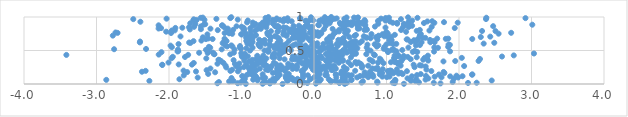
| Category | Series 0 |
|---|---|
| -0.4334073646067269 | 0.001 |
| -0.939989889521863 | 0.002 |
| 1.2405617422686799 | 0.003 |
| 0.4262052595053891 | 0.004 |
| -0.7084179706969396 | 0.005 |
| 0.026371199007586554 | 0.006 |
| 0.4197355923336872 | 0.007 |
| -0.6079167115914466 | 0.008 |
| 1.7446076683312128 | 0.009 |
| -0.7068555747968261 | 0.01 |
| -1.3325380423428452 | 0.011 |
| -1.0520788200525004 | 0.012 |
| 1.1143253733677696 | 0.013 |
| 0.3506991465777798 | 0.014 |
| -0.09265396512471646 | 0.015 |
| 2.1244856302807005 | 0.016 |
| 1.6524882005302848 | 0.017 |
| 0.4532999058368441 | 0.018 |
| 2.2437237397595773 | 0.019 |
| 1.0854853833457287 | 0.02 |
| 0.8759545842474674 | 0.021 |
| 0.6565602732987683 | 0.022 |
| -1.0106598257258739 | 0.023 |
| -0.13889777717082996 | 0.024 |
| 1.4479092154608768 | 0.025 |
| 0.34378344889433965 | 0.026 |
| 0.03760194395053418 | 0.027 |
| -0.6733068415117387 | 0.028 |
| -1.3115628436499165 | 0.029 |
| 1.9129522233115654 | 0.03 |
| -0.9605378301241476 | 0.031 |
| -0.6797413491408442 | 0.032 |
| 0.41761173556334974 | 0.033 |
| 0.23324107979920594 | 0.034 |
| 0.8714620650469147 | 0.035 |
| 0.07253313029421271 | 0.036 |
| -0.5498560819052356 | 0.037 |
| -0.24750394615729032 | 0.038 |
| -1.170913742902048 | 0.039 |
| 0.6747199698988968 | 0.04 |
| 0.23804257820382357 | 0.041 |
| -0.6091843622784143 | 0.042 |
| 1.3995825697188407 | 0.043 |
| -1.1388659981964393 | 0.044 |
| -1.1103735390533398 | 0.045 |
| -2.270802827437177 | 0.046 |
| 1.3367882534600461 | 0.047 |
| 0.2965901665627779 | 0.048 |
| -0.1938416605830513 | 0.049 |
| -0.37006355820149484 | 0.05 |
| -0.980141098250563 | 0.051 |
| 2.451292750344459 | 0.052 |
| -0.7795251129186216 | 0.053 |
| -0.36396117570223296 | 0.054 |
| 1.1232268789021767 | 0.055 |
| -0.35841521604838356 | 0.056 |
| -0.2849285408587434 | 0.057 |
| -0.24384661143231146 | 0.058 |
| 0.3940239492990827 | 0.059 |
| 0.5190762853444326 | 0.06 |
| 1.1184695994260725 | 0.061 |
| -2.865017453478459 | 0.062 |
| 0.5121580258730027 | 0.063 |
| -0.8389704716347115 | 0.064 |
| 1.538337877615482 | 0.065 |
| 0.09390023675950232 | 0.066 |
| 0.39757787905972286 | 0.067 |
| -0.05710177107560099 | 0.068 |
| 1.3307203521826176 | 0.069 |
| 0.20402396596835715 | 0.07 |
| -1.8562669029842231 | 0.071 |
| 1.4120314544509567 | 0.072 |
| -0.5350035023415929 | 0.073 |
| -0.9679350047809727 | 0.074 |
| -0.049438993206019965 | 0.075 |
| -0.9542135248979973 | 0.076 |
| -0.22768054035939223 | 0.077 |
| -0.7746380152175014 | 0.078 |
| 1.9299292074050731 | 0.079 |
| 0.429833434867227 | 0.08 |
| -0.5613754599807814 | 0.081 |
| -0.29444781087458605 | 0.082 |
| 1.5773354843357064 | 0.083 |
| 1.2897147121827155 | 0.084 |
| -0.6912212090515224 | 0.085 |
| -0.5151694951792836 | 0.086 |
| 0.07107838191121552 | 0.087 |
| 0.39901942942559465 | 0.088 |
| -1.1374363614291054 | 0.089 |
| -0.38752759048288965 | 0.09 |
| -0.7074572994240373 | 0.091 |
| -0.31305252145530815 | 0.092 |
| -0.6742272174610262 | 0.093 |
| -0.3509213025499349 | 0.094 |
| -0.15121483442379446 | 0.095 |
| -1.6041070323972493 | 0.096 |
| 1.9894150523607124 | 0.097 |
| 0.5948688133561522 | 0.098 |
| 0.30769961076061847 | 0.099 |
| 1.7593074792966918 | 0.1 |
| 0.004397286051987415 | 0.101 |
| 0.746408859515614 | 0.102 |
| 1.004650379601312 | 0.103 |
| 0.405678854290743 | 0.104 |
| -0.8022414939867222 | 0.105 |
| 0.04420225550819801 | 0.106 |
| 0.8175962081965871 | 0.107 |
| -0.4982477791079276 | 0.108 |
| 1.6640408987213435 | 0.109 |
| 0.9425712782497317 | 0.11 |
| 1.0423210478500922 | 0.111 |
| -0.9796353460120537 | 0.112 |
| -0.80089162458217 | 0.113 |
| 1.878850971655912 | 0.114 |
| 1.3500643606173046 | 0.115 |
| 2.048505086340027 | 0.116 |
| -0.3926718015736288 | 0.117 |
| -0.9909470555270534 | 0.118 |
| 0.6346064744748094 | 0.119 |
| 1.5447146991797451 | 0.12 |
| 0.49646894159085875 | 0.121 |
| 0.40157587272972783 | 0.122 |
| 0.7604725467324265 | 0.123 |
| 1.965048531532113 | 0.124 |
| 0.6801633323095366 | 0.125 |
| -0.15158060905314663 | 0.126 |
| 0.17690633805504774 | 0.127 |
| -0.8419979458006646 | 0.128 |
| -1.7961105308612728 | 0.129 |
| -0.08366216637337853 | 0.13 |
| 0.5211920037019411 | 0.131 |
| 0.15693250197809583 | 0.132 |
| 1.4199556729727085 | 0.133 |
| 0.7192236721436274 | 0.134 |
| 0.4732046609789178 | 0.135 |
| 0.8107709534255987 | 0.136 |
| -0.9235467213476181 | 0.137 |
| -0.47360254949273095 | 0.138 |
| 2.1799910839399814 | 0.139 |
| 0.29963139587660326 | 0.14 |
| 0.30335159402384804 | 0.141 |
| 1.723050308760551 | 0.142 |
| 2.184743299009444 | 0.143 |
| 0.9064870357201658 | 0.144 |
| -0.7076771551211385 | 0.145 |
| -0.8239011722037857 | 0.146 |
| 1.222266459305855 | 0.147 |
| 1.4722602482084426 | 0.148 |
| -0.5085893657633891 | 0.149 |
| -1.459789470289941 | 0.15 |
| -0.34843980797931806 | 0.151 |
| -0.14923922319025795 | 0.152 |
| 0.07839754005029853 | 0.153 |
| -0.8879883673925066 | 0.154 |
| 1.165953396124717 | 0.155 |
| 0.37379590087292147 | 0.156 |
| 0.05089962901384659 | 0.157 |
| -0.8503444646355236 | 0.158 |
| 0.41427596236939834 | 0.159 |
| -0.8850225094193842 | 0.16 |
| 1.0957762818134933 | 0.161 |
| 0.3911124502370109 | 0.162 |
| 0.9413574605796713 | 0.163 |
| 1.799036500969354 | 0.164 |
| 1.0369042795173389 | 0.165 |
| -0.5681890178720375 | 0.166 |
| 1.2011396510350112 | 0.167 |
| 0.7817973203908286 | 0.168 |
| -0.5041007567814502 | 0.169 |
| 0.05334944350710735 | 0.17 |
| 0.9263511612173296 | 0.171 |
| 1.0831280800480183 | 0.172 |
| 0.04866020864090714 | 0.173 |
| 0.6988674593576363 | 0.174 |
| -1.36373038757322 | 0.175 |
| 0.1698882466925573 | 0.176 |
| -0.8844673432820551 | 0.177 |
| -1.7483739072513629 | 0.178 |
| 0.0517443807141964 | 0.179 |
| 1.7875587738228242 | 0.18 |
| -0.5131498555934719 | 0.181 |
| 0.7721722529966009 | 0.182 |
| -2.373111820209326 | 0.183 |
| 1.145852080504973 | 0.184 |
| 0.9088565782813038 | 0.185 |
| 0.3795641733459103 | 0.186 |
| -1.6275002375514465 | 0.187 |
| -0.5034526955605809 | 0.188 |
| -1.0488757826669808 | 0.189 |
| -0.39560230772946614 | 0.19 |
| 1.2818986424648493 | 0.191 |
| -0.1707045652295509 | 0.192 |
| 1.6186221438098372 | 0.193 |
| 1.0198962063709587 | 0.194 |
| -1.153655556877105 | 0.195 |
| -2.322315006178832 | 0.196 |
| 0.5676207583245985 | 0.197 |
| 1.065159388694794 | 0.198 |
| 0.432074671768528 | 0.199 |
| -1.7992951095651595 | 0.2 |
| 1.0476043433274826 | 0.201 |
| -0.8433569625095174 | 0.202 |
| -0.14951334799523153 | 0.203 |
| -0.7953696284243454 | 0.204 |
| -0.15543003967784585 | 0.205 |
| -1.4813896907287933 | 0.206 |
| -0.6329918320029906 | 0.207 |
| 0.24451507782589577 | 0.208 |
| 0.2595083056665448 | 0.209 |
| -0.004752674283597713 | 0.21 |
| -0.46033337125274976 | 0.211 |
| -1.1296804534601925 | 0.212 |
| 0.0956043102574533 | 0.213 |
| -0.6611368800254134 | 0.214 |
| 1.5504905273570948 | 0.215 |
| -0.0158265711336405 | 0.216 |
| -0.4574583408740951 | 0.217 |
| 0.013700335959944354 | 0.218 |
| 1.1427518138597197 | 0.219 |
| -0.8897695776031274 | 0.22 |
| 0.1553012019026987 | 0.221 |
| 0.9485274389356038 | 0.222 |
| 0.8722093412662391 | 0.223 |
| 0.4496850645398469 | 0.224 |
| -0.2952770188008369 | 0.225 |
| -0.5084181546463835 | 0.226 |
| -0.23916688574648592 | 0.227 |
| 0.84421292414312 | 0.228 |
| 0.3011691595279018 | 0.229 |
| -0.7462129076706683 | 0.23 |
| -1.4283212716359373 | 0.231 |
| 0.8032795524260266 | 0.232 |
| -1.0278743958917573 | 0.233 |
| 0.031107569460051998 | 0.234 |
| 0.005122731323344176 | 0.235 |
| -0.6008314070957574 | 0.236 |
| 0.06899006584817613 | 0.237 |
| 0.0663587108743986 | 0.238 |
| -0.86971987119502 | 0.239 |
| -0.12156581204872907 | 0.24 |
| -0.12175508005397262 | 0.241 |
| 0.06276419407169254 | 0.242 |
| 0.22510043600184204 | 0.243 |
| 0.8738545522013013 | 0.244 |
| 0.6602057214166779 | 0.245 |
| -0.43323039727528556 | 0.246 |
| -1.2100352835183887 | 0.247 |
| -0.365743396824465 | 0.248 |
| -0.3602150881303068 | 0.249 |
| 0.08772647501639774 | 0.25 |
| 1.3872202637846724 | 0.251 |
| -0.9674995294876982 | 0.252 |
| 0.41396599546430846 | 0.253 |
| 0.02965276846248699 | 0.254 |
| 0.2812963971135991 | 0.255 |
| -0.9153309791628157 | 0.256 |
| -0.23239003615902298 | 0.257 |
| -0.0407841863433811 | 0.258 |
| 0.1630460551598647 | 0.259 |
| -0.5026464128086214 | 0.26 |
| 0.12527876789902148 | 0.261 |
| 1.5403971777236887 | 0.262 |
| -1.0721724084046436 | 0.263 |
| 0.6687236159201184 | 0.264 |
| -0.8223687338873491 | 0.265 |
| 0.24256959283218116 | 0.266 |
| -0.5854110249986268 | 0.267 |
| 2.0708557042875277 | 0.268 |
| 0.1904578965428403 | 0.269 |
| -0.648089185168498 | 0.27 |
| -1.0609507773447842 | 0.271 |
| 0.7465586524288517 | 0.272 |
| 0.2786409662512028 | 0.273 |
| 1.1952639721511442 | 0.274 |
| -1.2201102890481161 | 0.275 |
| 1.4824241243588636 | 0.276 |
| -0.24101059581652873 | 0.277 |
| -0.30441671662254777 | 0.278 |
| -0.4620878137908555 | 0.279 |
| 1.457946268571093 | 0.28 |
| 0.19666000960113816 | 0.281 |
| 0.5115803055798924 | 0.282 |
| -0.11296635552697243 | 0.283 |
| -0.6959408783178276 | 0.284 |
| -2.09364037900715 | 0.285 |
| -0.6861935246085427 | 0.286 |
| -2.0926137116004977 | 0.287 |
| 1.3742604210529432 | 0.288 |
| -1.6835856428119262 | 0.289 |
| -0.9357321834524939 | 0.29 |
| -0.005975816455721095 | 0.291 |
| -1.8659647576706018 | 0.292 |
| -0.7887099334983327 | 0.293 |
| -0.5190692777042489 | 0.294 |
| -0.022162146743186284 | 0.295 |
| -0.8520607547844561 | 0.296 |
| -0.8298466177942627 | 0.297 |
| -0.08192551220203637 | 0.298 |
| 0.6460173355145313 | 0.299 |
| -1.0908086642009955 | 0.3 |
| -0.3557627683433928 | 0.301 |
| 1.158290216551368 | 0.302 |
| -1.331443222231699 | 0.303 |
| 0.5885099058603913 | 0.304 |
| -1.0315578146120012 | 0.305 |
| -0.7868457924492303 | 0.306 |
| -0.16184018273465828 | 0.307 |
| -0.09245943064964557 | 0.308 |
| 0.03367743662375755 | 0.309 |
| 0.9587318791425021 | 0.31 |
| 1.1530430693387004 | 0.311 |
| 1.1726852886773704 | 0.312 |
| -0.1586450865022062 | 0.313 |
| -1.658197194084864 | 0.314 |
| -1.2494329115209357 | 0.315 |
| 0.06633072430617659 | 0.316 |
| 0.34239667409953256 | 0.317 |
| -0.5527745834217752 | 0.318 |
| 0.8833659243989516 | 0.319 |
| -2.006661737776946 | 0.32 |
| -0.7563712102604887 | 0.321 |
| 0.6139512014308934 | 0.322 |
| -0.6911063923022773 | 0.323 |
| -0.7414872847641663 | 0.324 |
| 1.0606826368020945 | 0.325 |
| 0.47394917455532504 | 0.326 |
| -0.782224334343308 | 0.327 |
| 0.5717563593310331 | 0.328 |
| 1.1112380256577001 | 0.329 |
| -0.20403099130518676 | 0.33 |
| 1.1253284475364564 | 0.331 |
| 0.1768320488393389 | 0.332 |
| -0.6854399186522695 | 0.333 |
| 0.8114857188351943 | 0.334 |
| 0.3489921497415489 | 0.335 |
| -0.05046704188499174 | 0.336 |
| 1.7854750308439513 | 0.337 |
| -0.8936552380333875 | 0.338 |
| -0.7515984510628595 | 0.339 |
| 0.22055388576712165 | 0.34 |
| -1.2801636822769442 | 0.341 |
| 1.2049357891778225 | 0.342 |
| 1.9482436374981367 | 0.343 |
| 2.2697978813679374 | 0.344 |
| 1.10597453265635 | 0.345 |
| 0.3998960338028015 | 0.346 |
| -0.10292013319574789 | 0.347 |
| -0.9603227425281 | 0.348 |
| 1.5762466433641764 | 0.349 |
| 0.31962515981985096 | 0.35 |
| 0.7940529826544136 | 0.351 |
| 0.1627533932439622 | 0.352 |
| 0.2972896393977891 | 0.353 |
| 0.9273713687871252 | 0.354 |
| -0.01591665336942505 | 0.355 |
| -1.1087087002632199 | 0.356 |
| 0.3626749902187898 | 0.357 |
| -0.10413074414349222 | 0.358 |
| -1.3059935049827391 | 0.359 |
| 0.028628135749537265 | 0.36 |
| -0.851117588831209 | 0.361 |
| -1.3177117778340133 | 0.362 |
| 1.5065328957769069 | 0.363 |
| 0.767383452526575 | 0.364 |
| 0.27419406315858286 | 0.365 |
| 0.3938534242306213 | 0.366 |
| -0.30304245607331115 | 0.367 |
| -0.40579275365645806 | 0.368 |
| -0.26761825152569774 | 0.369 |
| 1.333481157530752 | 0.37 |
| 0.2075694136078905 | 0.371 |
| -0.7979000965923877 | 0.372 |
| 2.289101109045932 | 0.373 |
| 1.560488974147555 | 0.374 |
| -0.24300810092169378 | 0.375 |
| -0.20030884656237102 | 0.376 |
| -0.7414653196780696 | 0.377 |
| 0.9081021742499278 | 0.378 |
| -0.6921989451618265 | 0.379 |
| 1.2290538262865303 | 0.38 |
| -0.6568176364982543 | 0.381 |
| -1.485643759424411 | 0.382 |
| -0.47292750665285954 | 0.383 |
| -0.7219503619876484 | 0.384 |
| -1.9641738665962638 | 0.385 |
| 0.06417746321728846 | 0.386 |
| 1.1040371896724084 | 0.387 |
| 0.10943640472872929 | 0.388 |
| 0.3307645919241651 | 0.389 |
| 2.03883909163099 | 0.39 |
| 1.5267205023048707 | 0.391 |
| 0.23385568980842208 | 0.392 |
| 0.0550819722932836 | 0.393 |
| 0.08155990160945237 | 0.394 |
| -0.9541988726692265 | 0.395 |
| 0.50874047294759 | 0.396 |
| -0.5438801930841937 | 0.397 |
| -0.11903540839545368 | 0.398 |
| 1.4169036328053597 | 0.399 |
| -0.5721943186091663 | 0.4 |
| 1.123641966909661 | 0.401 |
| -0.17144313865374983 | 0.402 |
| -1.7790199674980318 | 0.403 |
| 1.2933452189920294 | 0.404 |
| 0.19747511778305338 | 0.405 |
| -1.9472513861214198 | 0.406 |
| -0.9941587205182794 | 0.407 |
| -0.262889259771077 | 0.408 |
| -0.29362053281824263 | 0.409 |
| 2.5929828463551114 | 0.41 |
| 1.169122998267718 | 0.411 |
| -0.912520219718739 | 0.412 |
| -0.5664530596501285 | 0.413 |
| -0.1335620251276497 | 0.414 |
| -0.04361760114944069 | 0.415 |
| 0.016920743623393797 | 0.416 |
| 0.09239461140514216 | 0.417 |
| -0.11736960964954335 | 0.418 |
| 1.237862996708694 | 0.419 |
| -0.0463884573470299 | 0.42 |
| -0.7829063142911616 | 0.421 |
| 0.29754248643946646 | 0.422 |
| 1.5708402036895048 | 0.423 |
| 1.11179493928008 | 0.424 |
| -0.6990101498638763 | 0.425 |
| -0.997056266207105 | 0.426 |
| 2.7554581097491084 | 0.427 |
| 0.35215814213386043 | 0.428 |
| 1.1630107921893291 | 0.429 |
| 0.8393776772817061 | 0.43 |
| -0.012845543929070224 | 0.431 |
| -0.04540093091730402 | 0.432 |
| -0.03856717934085285 | 0.433 |
| -3.4156052474357357 | 0.434 |
| -1.735664934826385 | 0.435 |
| -0.5661671280289662 | 0.436 |
| 0.3928403621358658 | 0.437 |
| 0.5346349792086365 | 0.438 |
| -2.1417708058184943 | 0.439 |
| -0.18996845839261933 | 0.44 |
| -0.48833262370674646 | 0.441 |
| 0.8252296667296708 | 0.442 |
| -1.1555938547148266 | 0.443 |
| -1.3730579219372805 | 0.444 |
| 0.72131386098948 | 0.445 |
| -1.3784872949835183 | 0.446 |
| 0.27136609530521394 | 0.447 |
| 0.2304055681444792 | 0.448 |
| 0.1644966682132596 | 0.449 |
| -0.9525786719599321 | 0.45 |
| 0.5782393635439345 | 0.451 |
| 0.37201452668525903 | 0.452 |
| -0.022340539404364534 | 0.453 |
| -0.02576436014300576 | 0.454 |
| 3.0342458904284832 | 0.455 |
| -0.06119464395791763 | 0.456 |
| -0.45834601621428295 | 0.457 |
| -0.02630865087045997 | 0.458 |
| -0.5446507800875304 | 0.459 |
| -1.0031466135791822 | 0.46 |
| -0.1606245262815884 | 0.461 |
| 0.5267212749705479 | 0.462 |
| -1.4662365903855186 | 0.463 |
| 0.32818397536131716 | 0.464 |
| -0.45335277920938566 | 0.465 |
| -1.58448545432603 | 0.466 |
| -1.1055205264086263 | 0.467 |
| -1.3952054678133505 | 0.468 |
| 0.45314074556177797 | 0.469 |
| 0.31026849990799743 | 0.47 |
| 0.35733672284083795 | 0.471 |
| 0.5717281660531954 | 0.472 |
| 0.5274938366934183 | 0.473 |
| 0.01776221919283305 | 0.474 |
| -2.104048430157656 | 0.475 |
| 1.0210040614094247 | 0.476 |
| 0.06777890744500681 | 0.477 |
| 1.4239032500869673 | 0.478 |
| 1.3625139483762476 | 0.479 |
| -0.6311696049064377 | 0.48 |
| -0.10589943997119011 | 0.481 |
| -0.42183148953034344 | 0.482 |
| -0.05103986692401019 | 0.483 |
| 1.655885032584676 | 0.484 |
| -1.8820659758326634 | 0.485 |
| -1.4622608249160667 | 0.486 |
| 1.876583142208636 | 0.487 |
| 1.13728392520696 | 0.488 |
| 0.39214952008823545 | 0.489 |
| -0.11654639091270269 | 0.49 |
| -0.46093620791680223 | 0.491 |
| -1.8728463295830622 | 0.492 |
| -0.6260974709770535 | 0.493 |
| -0.40175691405211733 | 0.494 |
| 1.389080570773852 | 0.495 |
| 0.20917348876430442 | 0.496 |
| -0.18337981633072165 | 0.497 |
| 0.7798986187877892 | 0.498 |
| -0.8817061668872537 | 0.499 |
| -0.6821683361714772 | 0.5 |
| 1.1089334458919042 | 0.501 |
| 1.006404715469169 | 0.502 |
| -0.3188931364893053 | 0.503 |
| -0.4703576693181075 | 0.504 |
| 0.7451895706422089 | 0.505 |
| 1.0693678117035326 | 0.506 |
| 1.2173708468090894 | 0.507 |
| 0.10363338912804121 | 0.508 |
| 0.4289295886938156 | 0.509 |
| -1.4897852723134983 | 0.51 |
| 0.4090758541233317 | 0.511 |
| -0.40055564662783194 | 0.512 |
| -0.630590498551503 | 0.513 |
| -1.876261664110996 | 0.514 |
| -1.0958224269822239 | 0.515 |
| 0.2987524686738334 | 0.516 |
| -1.273065701605872 | 0.517 |
| 0.500293659378614 | 0.518 |
| -2.7570676352767194 | 0.519 |
| 0.2620421341040906 | 0.52 |
| -0.39541553389043926 | 0.521 |
| 1.089712987111005 | 0.522 |
| -2.3164796602033917 | 0.523 |
| -0.12497734191465426 | 0.524 |
| -0.0085754152551063 | 0.525 |
| 0.9616920150703283 | 0.526 |
| -0.12889447908937868 | 0.527 |
| 0.08612663628894346 | 0.528 |
| -0.5154236349761243 | 0.529 |
| -1.0063687976658988 | 0.53 |
| 0.21130608010760898 | 0.531 |
| 0.5116895187969401 | 0.532 |
| 0.14714933012745135 | 0.533 |
| -0.9320481634849074 | 0.534 |
| 0.5977841224621425 | 0.535 |
| -0.49773216723541314 | 0.536 |
| -0.07770087246693791 | 0.537 |
| 0.5591575325699552 | 0.538 |
| -0.5471792626135867 | 0.539 |
| 1.7098937744332172 | 0.54 |
| -1.4317214836462773 | 0.541 |
| -0.846679342308545 | 0.542 |
| 0.7272223821072767 | 0.543 |
| 1.301879318621765 | 0.544 |
| -1.0226988605742626 | 0.545 |
| 0.1917322345546646 | 0.546 |
| 1.6596717855490635 | 0.547 |
| -0.5013296731567474 | 0.548 |
| 0.12182977930005379 | 0.549 |
| -1.9604425965302648 | 0.55 |
| 0.11857289088973566 | 0.551 |
| 0.9704573387404132 | 0.552 |
| 1.8511137175648713 | 0.553 |
| -0.1987336925435912 | 0.554 |
| -1.4494008591954337 | 0.555 |
| -0.738614601238547 | 0.556 |
| 0.5022135301410966 | 0.557 |
| 0.8657628352336486 | 0.558 |
| -0.31314331007774765 | 0.559 |
| -1.1984111724642252 | 0.56 |
| -1.1261219038654575 | 0.561 |
| -0.42499585121479555 | 0.562 |
| 0.5290323372120058 | 0.563 |
| 0.546079868079854 | 0.564 |
| 0.04692607066626042 | 0.565 |
| -1.0206544891017932 | 0.566 |
| 0.4419654640485735 | 0.567 |
| 0.5739616024400735 | 0.568 |
| -0.7555136433454832 | 0.569 |
| 0.3292412028631615 | 0.57 |
| -0.6067194591846352 | 0.571 |
| -0.5376457851892544 | 0.572 |
| -1.9782524527619154 | 0.573 |
| -0.11920899354407055 | 0.574 |
| 1.4054616154817214 | 0.575 |
| -1.1405609713521034 | 0.576 |
| 0.2413831807482163 | 0.577 |
| 0.8874412211775189 | 0.578 |
| -1.2247979217287135 | 0.579 |
| -0.28159048382586427 | 0.58 |
| -0.43487177378018504 | 0.581 |
| 1.460753603688425 | 0.582 |
| -0.0022818769860881716 | 0.583 |
| 1.8741133193134631 | 0.584 |
| -0.866557718359596 | 0.585 |
| -0.026169299669445145 | 0.586 |
| 0.3172814221917397 | 0.587 |
| 0.736881033919154 | 0.588 |
| 1.8554883525787726 | 0.589 |
| -0.1900926987907532 | 0.59 |
| 0.9990306143618994 | 0.591 |
| -0.608389371670019 | 0.592 |
| 0.8370774414834017 | 0.593 |
| -0.251465041497438 | 0.594 |
| -0.7664836097347552 | 0.595 |
| -1.868448286742482 | 0.596 |
| 1.0917746253525795 | 0.597 |
| 0.12885335257647945 | 0.598 |
| 1.1352722474220762 | 0.599 |
| -0.38115059022132325 | 0.6 |
| -0.6731338462520284 | 0.601 |
| -0.9180103909598412 | 0.602 |
| 2.340550359284501 | 0.603 |
| 0.31976112494028186 | 0.604 |
| 0.4909104392345238 | 0.605 |
| -0.4957570006932137 | 0.606 |
| -0.7359745190435927 | 0.607 |
| 0.045881250048879885 | 0.608 |
| 1.0548892767977076 | 0.609 |
| -1.260177409245058 | 0.61 |
| 0.5616303570727164 | 0.611 |
| 0.4276799855395783 | 0.612 |
| -1.7045296740470688 | 0.613 |
| 0.6300271883630915 | 0.614 |
| 2.4866764303683144 | 0.615 |
| 0.3769185888161557 | 0.616 |
| -0.013516653219761032 | 0.617 |
| -0.5004436771900664 | 0.618 |
| -1.7221320475818542 | 0.619 |
| 0.18878867740590444 | 0.62 |
| -2.4021073187453714 | 0.621 |
| 1.4839332351637147 | 0.622 |
| 1.6043990944356077 | 0.623 |
| 1.6639176577899866 | 0.624 |
| -0.9199391055304229 | 0.625 |
| 0.41990871923170303 | 0.626 |
| 1.336029253093706 | 0.627 |
| -0.847467703863817 | 0.628 |
| -0.47882752787148153 | 0.629 |
| 0.22319353144046072 | 0.63 |
| 1.3962527668368692 | 0.631 |
| 0.5255966295924956 | 0.632 |
| 0.2067752445084423 | 0.633 |
| -2.399782704692221 | 0.634 |
| -0.7310835937435334 | 0.635 |
| -0.712771374642263 | 0.636 |
| -1.237449254356088 | 0.637 |
| 0.5726924295969926 | 0.638 |
| 0.6604367950549346 | 0.639 |
| -1.661846033276075 | 0.64 |
| -1.2060275816881632 | 0.641 |
| 1.648524494955339 | 0.642 |
| -0.193966368095138 | 0.643 |
| -0.9342799454289112 | 0.644 |
| -0.3442462081735531 | 0.645 |
| -0.46486098145337884 | 0.646 |
| 1.4217409842188875 | 0.647 |
| -1.5533346611051346 | 0.648 |
| 0.185699933971887 | 0.649 |
| -0.6059423127082519 | 0.65 |
| -0.05725721541079842 | 0.651 |
| 1.0385966013180985 | 0.652 |
| 1.3786273230894173 | 0.653 |
| 0.1966812150720587 | 0.654 |
| 0.8768440886765756 | 0.655 |
| 1.0707185165713557 | 0.656 |
| -0.6823193628267639 | 0.657 |
| 1.6003194814341137 | 0.658 |
| 0.33681015764331335 | 0.659 |
| -0.16968483096009734 | 0.66 |
| -0.7558207689118888 | 0.661 |
| -0.1586529328500399 | 0.662 |
| -0.05470294681748378 | 0.663 |
| 1.291592238537052 | 0.664 |
| -0.1762545032865166 | 0.665 |
| 1.2786351895051773 | 0.666 |
| -0.8778585613536043 | 0.667 |
| 0.18126888143226516 | 0.668 |
| 1.4292789755412638 | 0.669 |
| -1.490974446869168 | 0.67 |
| -1.3983918513531206 | 0.671 |
| 2.1827703134169614 | 0.672 |
| 0.20785435596184243 | 0.673 |
| 1.8179504178795867 | 0.674 |
| 0.3943945494225174 | 0.675 |
| -1.2337339278133532 | 0.676 |
| 1.8514785692581643 | 0.677 |
| 1.6990819130219368 | 0.678 |
| -0.2154385795483904 | 0.679 |
| -1.4573912086799696 | 0.68 |
| -0.29735661576552275 | 0.681 |
| -0.4854026044587352 | 0.682 |
| 0.77998174746181 | 0.683 |
| -0.8461566707264563 | 0.684 |
| -0.19220728591758274 | 0.685 |
| -0.08611635150732866 | 0.686 |
| 0.4097093547566857 | 0.687 |
| -0.9115849315169617 | 0.688 |
| 1.535738495707216 | 0.689 |
| 1.495716471025137 | 0.69 |
| -0.25989105065256446 | 0.691 |
| 0.7302519980727578 | 0.692 |
| 0.7198049648079143 | 0.693 |
| -0.936731052828149 | 0.694 |
| 0.24698590907333262 | 0.695 |
| -0.595581040108355 | 0.696 |
| -1.5334434431153863 | 0.697 |
| 0.854987173105008 | 0.698 |
| 0.48848685080328025 | 0.699 |
| -0.01778946905411516 | 0.7 |
| 2.3006637115170694 | 0.701 |
| 0.8785053146452402 | 0.702 |
| -0.5134156291731067 | 0.703 |
| -0.28144233933644003 | 0.704 |
| 1.0665641803889407 | 0.705 |
| 0.21949799460331043 | 0.706 |
| 2.431263413996893 | 0.707 |
| 1.0169879619565725 | 0.708 |
| -0.12845964342466765 | 0.709 |
| -1.8412289168509153 | 0.71 |
| 0.9711199870343981 | 0.711 |
| 0.8863420330827836 | 0.712 |
| 0.6868673909223162 | 0.713 |
| -0.5399067877817219 | 0.714 |
| -0.6125288025996909 | 0.715 |
| 0.06380350020669479 | 0.716 |
| 1.4604239226812759 | 0.717 |
| 0.5577447694513147 | 0.718 |
| -0.3790170821433305 | 0.719 |
| -0.8437869811026566 | 0.72 |
| 0.8904252859411255 | 0.721 |
| -2.774837710001446 | 0.722 |
| -0.8702379080793987 | 0.723 |
| -0.15170263955256313 | 0.724 |
| 1.4601533519890726 | 0.725 |
| -0.3797095498440761 | 0.726 |
| 0.2581922835357755 | 0.727 |
| -0.1956429328281608 | 0.728 |
| -0.8000654149074524 | 0.729 |
| 0.9518759359893512 | 0.73 |
| 0.036801145185817674 | 0.731 |
| 0.5782965385339525 | 0.732 |
| -0.11989818086506698 | 0.733 |
| 1.1150647164583978 | 0.734 |
| -0.13671212738779115 | 0.735 |
| -0.023359845794318268 | 0.736 |
| 0.016480025992941627 | 0.737 |
| -0.4229480666517986 | 0.738 |
| -0.9979774729676816 | 0.739 |
| -0.6398688854517118 | 0.74 |
| -1.470217842254736 | 0.741 |
| -0.9338648042299518 | 0.742 |
| -1.0043007436443192 | 0.743 |
| 0.9462452153284469 | 0.744 |
| 0.7926516521964917 | 0.745 |
| 1.4732279878704357 | 0.746 |
| 0.4506448999479131 | 0.747 |
| -0.41381533400894366 | 0.748 |
| -1.1279844581701086 | 0.749 |
| -0.2293571275973587 | 0.75 |
| 2.546105853909147 | 0.751 |
| -0.9424665652901911 | 0.752 |
| 0.10010686393866486 | 0.753 |
| 1.0172426495595595 | 0.754 |
| -0.29236200698546355 | 0.755 |
| -1.1705580334773984 | 0.756 |
| 0.28012775536955825 | 0.757 |
| 0.016892545749350063 | 0.758 |
| -0.18000953085215876 | 0.759 |
| -1.2326502780568918 | 0.76 |
| -1.9716020508784382 | 0.761 |
| -1.1624718866115966 | 0.762 |
| -2.7091819547494986 | 0.763 |
| 2.719572156939602 | 0.764 |
| -0.6407488314403516 | 0.765 |
| -0.6403357403165799 | 0.766 |
| -0.06036368620395649 | 0.767 |
| 0.426181530463305 | 0.768 |
| -2.7373128181211004 | 0.769 |
| 0.09912670689608749 | 0.77 |
| -0.2578987898863323 | 0.771 |
| 0.0479807552287248 | 0.772 |
| -1.172386045236058 | 0.773 |
| 0.30167691505559446 | 0.774 |
| -0.03561957862190823 | 0.775 |
| -1.9693249840737366 | 0.776 |
| 0.997277361416387 | 0.777 |
| -0.3381677268918084 | 0.778 |
| 1.2701166998896927 | 0.779 |
| -0.5033226165878446 | 0.78 |
| -2.039186461599853 | 0.781 |
| -0.8729371702479876 | 0.782 |
| -0.22609192882232598 | 0.783 |
| 0.34538417456683135 | 0.784 |
| -1.1985833019898724 | 0.785 |
| -0.008775044258703346 | 0.786 |
| -0.41759438846687935 | 0.787 |
| -0.5937137049150847 | 0.788 |
| -0.49717106103851627 | 0.789 |
| 2.503194785786876 | 0.79 |
| 2.317938647982553 | 0.791 |
| -0.18604530839699152 | 0.792 |
| 1.4170296353707155 | 0.793 |
| -0.81163526679242 | 0.794 |
| 0.4668462763455006 | 0.795 |
| -0.13981216086488946 | 0.796 |
| -0.014929390314365243 | 0.797 |
| 1.5918330856435334 | 0.798 |
| -1.9609937433890714 | 0.799 |
| -1.9208887755694306 | 0.8 |
| -0.23084145610006068 | 0.801 |
| -0.2068519596151086 | 0.802 |
| -0.3145350638108493 | 0.803 |
| -1.3273666702195177 | 0.804 |
| 0.6969317037605176 | 0.805 |
| 1.2014363965984938 | 0.806 |
| 1.4593860554565428 | 0.807 |
| -1.1154906118236232 | 0.808 |
| 0.7306965730356021 | 0.809 |
| 0.3482423602942042 | 0.81 |
| 0.42745491747108133 | 0.811 |
| -0.9728672499534579 | 0.812 |
| -0.3343825812884864 | 0.813 |
| -1.7124226133047982 | 0.814 |
| -0.17738237261676204 | 0.815 |
| -0.20604309816264355 | 0.816 |
| -0.9598925605686777 | 0.817 |
| -1.5596891483534794 | 0.818 |
| -0.047785054564157825 | 0.819 |
| 0.1403061870343194 | 0.82 |
| -0.2796186899160782 | 0.821 |
| 0.25678467241001446 | 0.822 |
| -0.7784742529241182 | 0.823 |
| -0.7324242011700619 | 0.824 |
| 0.6049048300596542 | 0.825 |
| -1.4282886363520984 | 0.826 |
| -1.1892698628924823 | 0.827 |
| -2.143437043064843 | 0.828 |
| 0.6268855568885723 | 0.829 |
| 0.7198182112360794 | 0.83 |
| 0.40865214751343437 | 0.831 |
| -0.7579827457886079 | 0.832 |
| -0.8786007307036714 | 0.833 |
| -2.1094408101300357 | 0.834 |
| 1.9414749853219568 | 0.835 |
| -0.05946381995498751 | 0.836 |
| -1.9121296464579602 | 0.837 |
| 0.40545778544616873 | 0.838 |
| -0.3803003749619256 | 0.839 |
| -1.8162260206938878 | 0.84 |
| -0.9730164829742387 | 0.841 |
| -0.18034900321104796 | 0.842 |
| 0.9860744505254555 | 0.843 |
| -0.47616591324096813 | 0.844 |
| -0.6580804387955679 | 0.845 |
| -0.41753096561504144 | 0.846 |
| -1.7238442880300155 | 0.847 |
| 0.6089853644192669 | 0.848 |
| 1.2287090866659058 | 0.849 |
| -1.2409037339940943 | 0.85 |
| 1.3047774411469124 | 0.851 |
| 1.623646463409358 | 0.852 |
| -1.653878020767146 | 0.853 |
| -0.028007161093146493 | 0.854 |
| -1.0004832309596967 | 0.855 |
| -0.5049575775622044 | 0.856 |
| 0.8404544770117752 | 0.857 |
| -0.11431489275897277 | 0.858 |
| 1.3095753911158674 | 0.859 |
| -1.5609294584722475 | 0.86 |
| -1.0688127358995612 | 0.861 |
| -0.5263433476835866 | 0.862 |
| 2.4711255555030665 | 0.863 |
| -0.5368730878896972 | 0.864 |
| -0.4975316699772181 | 0.865 |
| -0.2817631300703596 | 0.866 |
| -0.1175471548356084 | 0.867 |
| 0.16189374489146147 | 0.868 |
| 1.3535992944952966 | 0.869 |
| -0.2077948673703558 | 0.87 |
| -0.6962614867652954 | 0.871 |
| -0.8428337596796398 | 0.872 |
| -0.0846296822885213 | 0.873 |
| -1.2692129763012296 | 0.874 |
| -1.2623459666534194 | 0.875 |
| -2.143422952163677 | 0.876 |
| 0.06722865962067281 | 0.877 |
| 0.5212138132193145 | 0.878 |
| 0.44194166868895035 | 0.879 |
| 0.7076435648409989 | 0.88 |
| -0.7476027754328296 | 0.881 |
| 0.05901813950995205 | 0.882 |
| -0.8224122178621069 | 0.883 |
| 0.6970758406122881 | 0.884 |
| 3.011072875931003 | 0.885 |
| 0.5948618045459284 | 0.886 |
| -1.521087940856317 | 0.887 |
| 1.307061689511209 | 0.888 |
| 0.4419134113439309 | 0.889 |
| 0.4794865772359804 | 0.89 |
| 1.2454602534792443 | 0.891 |
| 0.3782830471853984 | 0.892 |
| -1.500061169050448 | 0.893 |
| 0.36591686546552626 | 0.894 |
| -1.6366225007858697 | 0.895 |
| 1.239028100255135 | 0.896 |
| -0.8091822478436725 | 0.897 |
| -0.6444069878321246 | 0.898 |
| 0.8866145396774083 | 0.899 |
| 1.1469802927946908 | 0.9 |
| 0.5232883951886382 | 0.901 |
| -0.7006208345841998 | 0.902 |
| 0.6520980443582021 | 0.903 |
| -0.5686668811078333 | 0.904 |
| 0.21400382598696677 | 0.905 |
| -1.7067658478404484 | 0.906 |
| 0.6102186392513689 | 0.907 |
| 0.690569666207332 | 0.908 |
| 0.1579028076829836 | 0.909 |
| 1.5168793870665525 | 0.91 |
| 0.3575435805922318 | 0.911 |
| 1.1437970302056097 | 0.912 |
| 1.6601361173082632 | 0.913 |
| 1.0868703167133758 | 0.914 |
| 1.9822906815880401 | 0.915 |
| -0.7082248853398916 | 0.916 |
| -0.8439419090786267 | 0.917 |
| 0.41348465217987496 | 0.918 |
| 0.6721194073346037 | 0.919 |
| -0.9233029461862126 | 0.92 |
| 0.5149696551719289 | 0.921 |
| 0.4646773971165761 | 0.922 |
| 1.7931921405181965 | 0.923 |
| 1.3029602032194916 | 0.924 |
| 0.6151104810962229 | 0.925 |
| 0.43215484092699796 | 0.926 |
| 0.5502045671925817 | 0.927 |
| 0.22069117148577533 | 0.928 |
| -2.394692071220608 | 0.929 |
| -0.08076937688167707 | 0.93 |
| 0.1257021127182254 | 0.931 |
| 1.0486574403062434 | 0.932 |
| 0.7076888408758117 | 0.933 |
| 1.5640211815454972 | 0.934 |
| -0.4249443115859375 | 0.935 |
| -0.30784215017914995 | 0.936 |
| 1.630657124472572 | 0.937 |
| -0.6345027542999366 | 0.938 |
| -0.11514739739907753 | 0.939 |
| -0.6735939299795444 | 0.94 |
| 0.8828079539816418 | 0.941 |
| -0.3579444331354713 | 0.942 |
| 0.07182834090614953 | 0.943 |
| -0.1099791845046818 | 0.944 |
| 0.17617850792135936 | 0.945 |
| 1.3540917840839812 | 0.946 |
| 0.9852280367030035 | 0.947 |
| -0.91337584226088 | 0.948 |
| -1.6643897377250108 | 0.949 |
| 0.23772900595760937 | 0.95 |
| -0.011945693309224126 | 0.951 |
| -0.4012685557825755 | 0.952 |
| -0.5291935854183469 | 0.953 |
| 0.6984419139650706 | 0.954 |
| -1.6197265864959354 | 0.955 |
| -0.5687896485148016 | 0.956 |
| -0.471071516336127 | 0.957 |
| -1.5108479242758701 | 0.958 |
| -0.4185939337643436 | 0.959 |
| 0.10390192851855407 | 0.96 |
| -1.0518817420545252 | 0.961 |
| 1.0044944058009735 | 0.962 |
| -0.03230950117534093 | 0.963 |
| -0.047549814374971966 | 0.964 |
| -1.6584144532434282 | 0.965 |
| -0.40972890739070955 | 0.966 |
| 1.1994369910592741 | 0.967 |
| -2.4927014803671335 | 0.968 |
| 2.3726618847175907 | 0.969 |
| -0.028581129217871037 | 0.97 |
| 0.19363442131098552 | 0.971 |
| -1.3464487438030703 | 0.972 |
| 0.28354340854023086 | 0.973 |
| 0.41820629588826197 | 0.974 |
| -2.0336426950505264 | 0.975 |
| 0.9246627923259307 | 0.976 |
| -0.18507825155512325 | 0.977 |
| -0.514720629085196 | 0.978 |
| 0.3132094910311105 | 0.979 |
| 0.5996928589464243 | 0.98 |
| -0.3644973282848234 | 0.981 |
| -0.19374131048239907 | 0.982 |
| 2.9169247849544977 | 0.983 |
| -1.1545554958928106 | 0.984 |
| 0.9888887787591063 | 0.985 |
| -0.6676891321882001 | 0.986 |
| 1.4268880581332652 | 0.987 |
| -1.5610595058769947 | 0.988 |
| 2.3772729753138044 | 0.989 |
| 1.0336591993904385 | 0.99 |
| -1.5338682474137766 | 0.991 |
| 0.5530674392697383 | 0.992 |
| 0.449686397207846 | 0.993 |
| 0.6070897638548765 | 0.994 |
| 1.297486566543311 | 0.995 |
| -0.04172006899346403 | 0.996 |
| -1.1412110804095983 | 0.997 |
| 0.14930770853250852 | 0.998 |
| -0.6297173868825423 | 0.999 |
| 0.2371497306477357 | 1 |